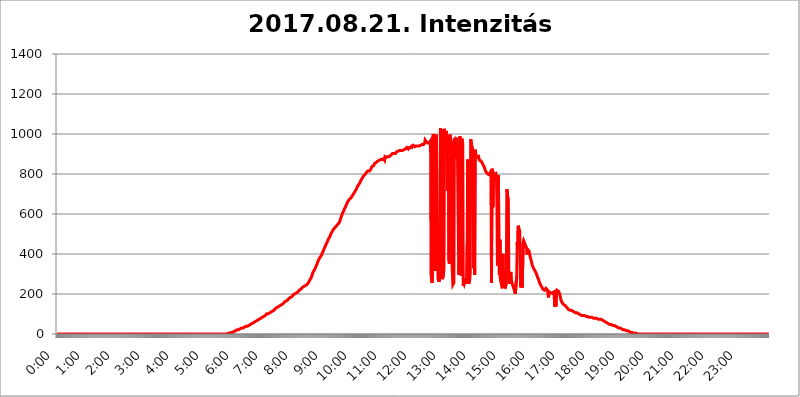
| Category | 2017.08.21. Intenzitás [W/m^2] |
|---|---|
| 0.0 | 0 |
| 0.0006944444444444445 | 0 |
| 0.001388888888888889 | 0 |
| 0.0020833333333333333 | 0 |
| 0.002777777777777778 | 0 |
| 0.003472222222222222 | 0 |
| 0.004166666666666667 | 0 |
| 0.004861111111111111 | 0 |
| 0.005555555555555556 | 0 |
| 0.0062499999999999995 | 0 |
| 0.006944444444444444 | 0 |
| 0.007638888888888889 | 0 |
| 0.008333333333333333 | 0 |
| 0.009027777777777779 | 0 |
| 0.009722222222222222 | 0 |
| 0.010416666666666666 | 0 |
| 0.011111111111111112 | 0 |
| 0.011805555555555555 | 0 |
| 0.012499999999999999 | 0 |
| 0.013194444444444444 | 0 |
| 0.013888888888888888 | 0 |
| 0.014583333333333332 | 0 |
| 0.015277777777777777 | 0 |
| 0.015972222222222224 | 0 |
| 0.016666666666666666 | 0 |
| 0.017361111111111112 | 0 |
| 0.018055555555555557 | 0 |
| 0.01875 | 0 |
| 0.019444444444444445 | 0 |
| 0.02013888888888889 | 0 |
| 0.020833333333333332 | 0 |
| 0.02152777777777778 | 0 |
| 0.022222222222222223 | 0 |
| 0.02291666666666667 | 0 |
| 0.02361111111111111 | 0 |
| 0.024305555555555556 | 0 |
| 0.024999999999999998 | 0 |
| 0.025694444444444447 | 0 |
| 0.02638888888888889 | 0 |
| 0.027083333333333334 | 0 |
| 0.027777777777777776 | 0 |
| 0.02847222222222222 | 0 |
| 0.029166666666666664 | 0 |
| 0.029861111111111113 | 0 |
| 0.030555555555555555 | 0 |
| 0.03125 | 0 |
| 0.03194444444444445 | 0 |
| 0.03263888888888889 | 0 |
| 0.03333333333333333 | 0 |
| 0.034027777777777775 | 0 |
| 0.034722222222222224 | 0 |
| 0.035416666666666666 | 0 |
| 0.036111111111111115 | 0 |
| 0.03680555555555556 | 0 |
| 0.0375 | 0 |
| 0.03819444444444444 | 0 |
| 0.03888888888888889 | 0 |
| 0.03958333333333333 | 0 |
| 0.04027777777777778 | 0 |
| 0.04097222222222222 | 0 |
| 0.041666666666666664 | 0 |
| 0.042361111111111106 | 0 |
| 0.04305555555555556 | 0 |
| 0.043750000000000004 | 0 |
| 0.044444444444444446 | 0 |
| 0.04513888888888889 | 0 |
| 0.04583333333333334 | 0 |
| 0.04652777777777778 | 0 |
| 0.04722222222222222 | 0 |
| 0.04791666666666666 | 0 |
| 0.04861111111111111 | 0 |
| 0.049305555555555554 | 0 |
| 0.049999999999999996 | 0 |
| 0.05069444444444445 | 0 |
| 0.051388888888888894 | 0 |
| 0.052083333333333336 | 0 |
| 0.05277777777777778 | 0 |
| 0.05347222222222222 | 0 |
| 0.05416666666666667 | 0 |
| 0.05486111111111111 | 0 |
| 0.05555555555555555 | 0 |
| 0.05625 | 0 |
| 0.05694444444444444 | 0 |
| 0.057638888888888885 | 0 |
| 0.05833333333333333 | 0 |
| 0.05902777777777778 | 0 |
| 0.059722222222222225 | 0 |
| 0.06041666666666667 | 0 |
| 0.061111111111111116 | 0 |
| 0.06180555555555556 | 0 |
| 0.0625 | 0 |
| 0.06319444444444444 | 0 |
| 0.06388888888888888 | 0 |
| 0.06458333333333334 | 0 |
| 0.06527777777777778 | 0 |
| 0.06597222222222222 | 0 |
| 0.06666666666666667 | 0 |
| 0.06736111111111111 | 0 |
| 0.06805555555555555 | 0 |
| 0.06874999999999999 | 0 |
| 0.06944444444444443 | 0 |
| 0.07013888888888889 | 0 |
| 0.07083333333333333 | 0 |
| 0.07152777777777779 | 0 |
| 0.07222222222222223 | 0 |
| 0.07291666666666667 | 0 |
| 0.07361111111111111 | 0 |
| 0.07430555555555556 | 0 |
| 0.075 | 0 |
| 0.07569444444444444 | 0 |
| 0.0763888888888889 | 0 |
| 0.07708333333333334 | 0 |
| 0.07777777777777778 | 0 |
| 0.07847222222222222 | 0 |
| 0.07916666666666666 | 0 |
| 0.0798611111111111 | 0 |
| 0.08055555555555556 | 0 |
| 0.08125 | 0 |
| 0.08194444444444444 | 0 |
| 0.08263888888888889 | 0 |
| 0.08333333333333333 | 0 |
| 0.08402777777777777 | 0 |
| 0.08472222222222221 | 0 |
| 0.08541666666666665 | 0 |
| 0.08611111111111112 | 0 |
| 0.08680555555555557 | 0 |
| 0.08750000000000001 | 0 |
| 0.08819444444444445 | 0 |
| 0.08888888888888889 | 0 |
| 0.08958333333333333 | 0 |
| 0.09027777777777778 | 0 |
| 0.09097222222222222 | 0 |
| 0.09166666666666667 | 0 |
| 0.09236111111111112 | 0 |
| 0.09305555555555556 | 0 |
| 0.09375 | 0 |
| 0.09444444444444444 | 0 |
| 0.09513888888888888 | 0 |
| 0.09583333333333333 | 0 |
| 0.09652777777777777 | 0 |
| 0.09722222222222222 | 0 |
| 0.09791666666666667 | 0 |
| 0.09861111111111111 | 0 |
| 0.09930555555555555 | 0 |
| 0.09999999999999999 | 0 |
| 0.10069444444444443 | 0 |
| 0.1013888888888889 | 0 |
| 0.10208333333333335 | 0 |
| 0.10277777777777779 | 0 |
| 0.10347222222222223 | 0 |
| 0.10416666666666667 | 0 |
| 0.10486111111111111 | 0 |
| 0.10555555555555556 | 0 |
| 0.10625 | 0 |
| 0.10694444444444444 | 0 |
| 0.1076388888888889 | 0 |
| 0.10833333333333334 | 0 |
| 0.10902777777777778 | 0 |
| 0.10972222222222222 | 0 |
| 0.1111111111111111 | 0 |
| 0.11180555555555556 | 0 |
| 0.11180555555555556 | 0 |
| 0.1125 | 0 |
| 0.11319444444444444 | 0 |
| 0.11388888888888889 | 0 |
| 0.11458333333333333 | 0 |
| 0.11527777777777777 | 0 |
| 0.11597222222222221 | 0 |
| 0.11666666666666665 | 0 |
| 0.1173611111111111 | 0 |
| 0.11805555555555557 | 0 |
| 0.11944444444444445 | 0 |
| 0.12013888888888889 | 0 |
| 0.12083333333333333 | 0 |
| 0.12152777777777778 | 0 |
| 0.12222222222222223 | 0 |
| 0.12291666666666667 | 0 |
| 0.12291666666666667 | 0 |
| 0.12361111111111112 | 0 |
| 0.12430555555555556 | 0 |
| 0.125 | 0 |
| 0.12569444444444444 | 0 |
| 0.12638888888888888 | 0 |
| 0.12708333333333333 | 0 |
| 0.16875 | 0 |
| 0.12847222222222224 | 0 |
| 0.12916666666666668 | 0 |
| 0.12986111111111112 | 0 |
| 0.13055555555555556 | 0 |
| 0.13125 | 0 |
| 0.13194444444444445 | 0 |
| 0.1326388888888889 | 0 |
| 0.13333333333333333 | 0 |
| 0.13402777777777777 | 0 |
| 0.13402777777777777 | 0 |
| 0.13472222222222222 | 0 |
| 0.13541666666666666 | 0 |
| 0.1361111111111111 | 0 |
| 0.13749999999999998 | 0 |
| 0.13819444444444443 | 0 |
| 0.1388888888888889 | 0 |
| 0.13958333333333334 | 0 |
| 0.14027777777777778 | 0 |
| 0.14097222222222222 | 0 |
| 0.14166666666666666 | 0 |
| 0.1423611111111111 | 0 |
| 0.14305555555555557 | 0 |
| 0.14375000000000002 | 0 |
| 0.14444444444444446 | 0 |
| 0.1451388888888889 | 0 |
| 0.1451388888888889 | 0 |
| 0.14652777777777778 | 0 |
| 0.14722222222222223 | 0 |
| 0.14791666666666667 | 0 |
| 0.1486111111111111 | 0 |
| 0.14930555555555555 | 0 |
| 0.15 | 0 |
| 0.15069444444444444 | 0 |
| 0.15138888888888888 | 0 |
| 0.15208333333333332 | 0 |
| 0.15277777777777776 | 0 |
| 0.15347222222222223 | 0 |
| 0.15416666666666667 | 0 |
| 0.15486111111111112 | 0 |
| 0.15555555555555556 | 0 |
| 0.15625 | 0 |
| 0.15694444444444444 | 0 |
| 0.15763888888888888 | 0 |
| 0.15833333333333333 | 0 |
| 0.15902777777777777 | 0 |
| 0.15972222222222224 | 0 |
| 0.16041666666666668 | 0 |
| 0.16111111111111112 | 0 |
| 0.16180555555555556 | 0 |
| 0.1625 | 0 |
| 0.16319444444444445 | 0 |
| 0.1638888888888889 | 0 |
| 0.16458333333333333 | 0 |
| 0.16527777777777777 | 0 |
| 0.16597222222222222 | 0 |
| 0.16666666666666666 | 0 |
| 0.1673611111111111 | 0 |
| 0.16805555555555554 | 0 |
| 0.16874999999999998 | 0 |
| 0.16944444444444443 | 0 |
| 0.17013888888888887 | 0 |
| 0.1708333333333333 | 0 |
| 0.17152777777777775 | 0 |
| 0.17222222222222225 | 0 |
| 0.1729166666666667 | 0 |
| 0.17361111111111113 | 0 |
| 0.17430555555555557 | 0 |
| 0.17500000000000002 | 0 |
| 0.17569444444444446 | 0 |
| 0.1763888888888889 | 0 |
| 0.17708333333333334 | 0 |
| 0.17777777777777778 | 0 |
| 0.17847222222222223 | 0 |
| 0.17916666666666667 | 0 |
| 0.1798611111111111 | 0 |
| 0.18055555555555555 | 0 |
| 0.18125 | 0 |
| 0.18194444444444444 | 0 |
| 0.1826388888888889 | 0 |
| 0.18333333333333335 | 0 |
| 0.1840277777777778 | 0 |
| 0.18472222222222223 | 0 |
| 0.18541666666666667 | 0 |
| 0.18611111111111112 | 0 |
| 0.18680555555555556 | 0 |
| 0.1875 | 0 |
| 0.18819444444444444 | 0 |
| 0.18888888888888888 | 0 |
| 0.18958333333333333 | 0 |
| 0.19027777777777777 | 0 |
| 0.1909722222222222 | 0 |
| 0.19166666666666665 | 0 |
| 0.19236111111111112 | 0 |
| 0.19305555555555554 | 0 |
| 0.19375 | 0 |
| 0.19444444444444445 | 0 |
| 0.1951388888888889 | 0 |
| 0.19583333333333333 | 0 |
| 0.19652777777777777 | 0 |
| 0.19722222222222222 | 0 |
| 0.19791666666666666 | 0 |
| 0.1986111111111111 | 0 |
| 0.19930555555555554 | 0 |
| 0.19999999999999998 | 0 |
| 0.20069444444444443 | 0 |
| 0.20138888888888887 | 0 |
| 0.2020833333333333 | 0 |
| 0.2027777777777778 | 0 |
| 0.2034722222222222 | 0 |
| 0.2041666666666667 | 0 |
| 0.20486111111111113 | 0 |
| 0.20555555555555557 | 0 |
| 0.20625000000000002 | 0 |
| 0.20694444444444446 | 0 |
| 0.2076388888888889 | 0 |
| 0.20833333333333334 | 0 |
| 0.20902777777777778 | 0 |
| 0.20972222222222223 | 0 |
| 0.21041666666666667 | 0 |
| 0.2111111111111111 | 0 |
| 0.21180555555555555 | 0 |
| 0.2125 | 0 |
| 0.21319444444444444 | 0 |
| 0.2138888888888889 | 0 |
| 0.21458333333333335 | 0 |
| 0.2152777777777778 | 0 |
| 0.21597222222222223 | 0 |
| 0.21666666666666667 | 0 |
| 0.21736111111111112 | 0 |
| 0.21805555555555556 | 0 |
| 0.21875 | 0 |
| 0.21944444444444444 | 0 |
| 0.22013888888888888 | 0 |
| 0.22083333333333333 | 0 |
| 0.22152777777777777 | 0 |
| 0.2222222222222222 | 0 |
| 0.22291666666666665 | 0 |
| 0.2236111111111111 | 0 |
| 0.22430555555555556 | 0 |
| 0.225 | 0 |
| 0.22569444444444445 | 0 |
| 0.2263888888888889 | 0 |
| 0.22708333333333333 | 0 |
| 0.22777777777777777 | 0 |
| 0.22847222222222222 | 0 |
| 0.22916666666666666 | 0 |
| 0.2298611111111111 | 0 |
| 0.23055555555555554 | 0 |
| 0.23124999999999998 | 0 |
| 0.23194444444444443 | 0 |
| 0.23263888888888887 | 0 |
| 0.2333333333333333 | 0 |
| 0.2340277777777778 | 0 |
| 0.2347222222222222 | 0 |
| 0.2354166666666667 | 0 |
| 0.23611111111111113 | 0 |
| 0.23680555555555557 | 0 |
| 0.23750000000000002 | 0 |
| 0.23819444444444446 | 0 |
| 0.2388888888888889 | 3.525 |
| 0.23958333333333334 | 3.525 |
| 0.24027777777777778 | 3.525 |
| 0.24097222222222223 | 3.525 |
| 0.24166666666666667 | 3.525 |
| 0.2423611111111111 | 3.525 |
| 0.24305555555555555 | 3.525 |
| 0.24375 | 7.887 |
| 0.24444444444444446 | 7.887 |
| 0.24513888888888888 | 7.887 |
| 0.24583333333333335 | 7.887 |
| 0.2465277777777778 | 12.257 |
| 0.24722222222222223 | 12.257 |
| 0.24791666666666667 | 12.257 |
| 0.24861111111111112 | 12.257 |
| 0.24930555555555556 | 12.257 |
| 0.25 | 16.636 |
| 0.25069444444444444 | 16.636 |
| 0.2513888888888889 | 16.636 |
| 0.2520833333333333 | 21.024 |
| 0.25277777777777777 | 21.024 |
| 0.2534722222222222 | 21.024 |
| 0.25416666666666665 | 21.024 |
| 0.2548611111111111 | 21.024 |
| 0.2555555555555556 | 21.024 |
| 0.25625000000000003 | 25.419 |
| 0.2569444444444445 | 25.419 |
| 0.2576388888888889 | 25.419 |
| 0.25833333333333336 | 29.823 |
| 0.2590277777777778 | 29.823 |
| 0.25972222222222224 | 29.823 |
| 0.2604166666666667 | 29.823 |
| 0.2611111111111111 | 29.823 |
| 0.26180555555555557 | 29.823 |
| 0.2625 | 34.234 |
| 0.26319444444444445 | 34.234 |
| 0.2638888888888889 | 34.234 |
| 0.26458333333333334 | 38.653 |
| 0.2652777777777778 | 38.653 |
| 0.2659722222222222 | 38.653 |
| 0.26666666666666666 | 38.653 |
| 0.2673611111111111 | 43.079 |
| 0.26805555555555555 | 43.079 |
| 0.26875 | 43.079 |
| 0.26944444444444443 | 43.079 |
| 0.2701388888888889 | 47.511 |
| 0.2708333333333333 | 47.511 |
| 0.27152777777777776 | 47.511 |
| 0.2722222222222222 | 51.951 |
| 0.27291666666666664 | 51.951 |
| 0.2736111111111111 | 51.951 |
| 0.2743055555555555 | 56.398 |
| 0.27499999999999997 | 56.398 |
| 0.27569444444444446 | 56.398 |
| 0.27638888888888885 | 56.398 |
| 0.27708333333333335 | 60.85 |
| 0.2777777777777778 | 60.85 |
| 0.27847222222222223 | 65.31 |
| 0.2791666666666667 | 65.31 |
| 0.2798611111111111 | 65.31 |
| 0.28055555555555556 | 65.31 |
| 0.28125 | 69.775 |
| 0.28194444444444444 | 69.775 |
| 0.2826388888888889 | 74.246 |
| 0.2833333333333333 | 74.246 |
| 0.28402777777777777 | 74.246 |
| 0.2847222222222222 | 78.722 |
| 0.28541666666666665 | 78.722 |
| 0.28611111111111115 | 83.205 |
| 0.28680555555555554 | 83.205 |
| 0.28750000000000003 | 83.205 |
| 0.2881944444444445 | 83.205 |
| 0.2888888888888889 | 87.692 |
| 0.28958333333333336 | 87.692 |
| 0.2902777777777778 | 92.184 |
| 0.29097222222222224 | 92.184 |
| 0.2916666666666667 | 92.184 |
| 0.2923611111111111 | 92.184 |
| 0.29305555555555557 | 96.682 |
| 0.29375 | 101.184 |
| 0.29444444444444445 | 101.184 |
| 0.2951388888888889 | 101.184 |
| 0.29583333333333334 | 101.184 |
| 0.2965277777777778 | 101.184 |
| 0.2972222222222222 | 105.69 |
| 0.29791666666666666 | 105.69 |
| 0.2986111111111111 | 110.201 |
| 0.29930555555555555 | 110.201 |
| 0.3 | 110.201 |
| 0.30069444444444443 | 110.201 |
| 0.3013888888888889 | 114.716 |
| 0.3020833333333333 | 114.716 |
| 0.30277777777777776 | 119.235 |
| 0.3034722222222222 | 119.235 |
| 0.30416666666666664 | 119.235 |
| 0.3048611111111111 | 123.758 |
| 0.3055555555555555 | 123.758 |
| 0.30624999999999997 | 128.284 |
| 0.3069444444444444 | 128.284 |
| 0.3076388888888889 | 128.284 |
| 0.30833333333333335 | 132.814 |
| 0.3090277777777778 | 132.814 |
| 0.30972222222222223 | 137.347 |
| 0.3104166666666667 | 137.347 |
| 0.3111111111111111 | 137.347 |
| 0.31180555555555556 | 141.884 |
| 0.3125 | 141.884 |
| 0.31319444444444444 | 141.884 |
| 0.3138888888888889 | 146.423 |
| 0.3145833333333333 | 146.423 |
| 0.31527777777777777 | 146.423 |
| 0.3159722222222222 | 150.964 |
| 0.31666666666666665 | 150.964 |
| 0.31736111111111115 | 155.509 |
| 0.31805555555555554 | 155.509 |
| 0.31875000000000003 | 160.056 |
| 0.3194444444444445 | 160.056 |
| 0.3201388888888889 | 160.056 |
| 0.32083333333333336 | 164.605 |
| 0.3215277777777778 | 164.605 |
| 0.32222222222222224 | 169.156 |
| 0.3229166666666667 | 169.156 |
| 0.3236111111111111 | 173.709 |
| 0.32430555555555557 | 173.709 |
| 0.325 | 178.264 |
| 0.32569444444444445 | 178.264 |
| 0.3263888888888889 | 182.82 |
| 0.32708333333333334 | 182.82 |
| 0.3277777777777778 | 182.82 |
| 0.3284722222222222 | 187.378 |
| 0.32916666666666666 | 187.378 |
| 0.3298611111111111 | 191.937 |
| 0.33055555555555555 | 191.937 |
| 0.33125 | 196.497 |
| 0.33194444444444443 | 196.497 |
| 0.3326388888888889 | 196.497 |
| 0.3333333333333333 | 201.058 |
| 0.3340277777777778 | 201.058 |
| 0.3347222222222222 | 201.058 |
| 0.3354166666666667 | 205.62 |
| 0.3361111111111111 | 205.62 |
| 0.3368055555555556 | 210.182 |
| 0.33749999999999997 | 210.182 |
| 0.33819444444444446 | 214.746 |
| 0.33888888888888885 | 214.746 |
| 0.33958333333333335 | 219.309 |
| 0.34027777777777773 | 219.309 |
| 0.34097222222222223 | 219.309 |
| 0.3416666666666666 | 223.873 |
| 0.3423611111111111 | 223.873 |
| 0.3430555555555555 | 228.436 |
| 0.34375 | 233 |
| 0.3444444444444445 | 233 |
| 0.3451388888888889 | 233 |
| 0.3458333333333334 | 237.564 |
| 0.34652777777777777 | 237.564 |
| 0.34722222222222227 | 242.127 |
| 0.34791666666666665 | 242.127 |
| 0.34861111111111115 | 246.689 |
| 0.34930555555555554 | 246.689 |
| 0.35000000000000003 | 246.689 |
| 0.3506944444444444 | 251.251 |
| 0.3513888888888889 | 251.251 |
| 0.3520833333333333 | 255.813 |
| 0.3527777777777778 | 260.373 |
| 0.3534722222222222 | 264.932 |
| 0.3541666666666667 | 269.49 |
| 0.3548611111111111 | 274.047 |
| 0.35555555555555557 | 278.603 |
| 0.35625 | 283.156 |
| 0.35694444444444445 | 287.709 |
| 0.3576388888888889 | 296.808 |
| 0.35833333333333334 | 305.898 |
| 0.3590277777777778 | 310.44 |
| 0.3597222222222222 | 314.98 |
| 0.36041666666666666 | 319.517 |
| 0.3611111111111111 | 324.052 |
| 0.36180555555555555 | 328.584 |
| 0.3625 | 333.113 |
| 0.36319444444444443 | 342.162 |
| 0.3638888888888889 | 346.682 |
| 0.3645833333333333 | 351.198 |
| 0.3652777777777778 | 360.221 |
| 0.3659722222222222 | 364.728 |
| 0.3666666666666667 | 369.23 |
| 0.3673611111111111 | 378.224 |
| 0.3680555555555556 | 378.224 |
| 0.36874999999999997 | 382.715 |
| 0.36944444444444446 | 387.202 |
| 0.37013888888888885 | 391.685 |
| 0.37083333333333335 | 396.164 |
| 0.37152777777777773 | 400.638 |
| 0.37222222222222223 | 409.574 |
| 0.3729166666666666 | 414.035 |
| 0.3736111111111111 | 418.492 |
| 0.3743055555555555 | 427.39 |
| 0.375 | 431.833 |
| 0.3756944444444445 | 436.27 |
| 0.3763888888888889 | 440.702 |
| 0.3770833333333334 | 449.551 |
| 0.37777777777777777 | 453.968 |
| 0.37847222222222227 | 458.38 |
| 0.37916666666666665 | 462.786 |
| 0.37986111111111115 | 471.582 |
| 0.38055555555555554 | 475.972 |
| 0.38125000000000003 | 480.356 |
| 0.3819444444444444 | 484.735 |
| 0.3826388888888889 | 489.108 |
| 0.3833333333333333 | 497.836 |
| 0.3840277777777778 | 497.836 |
| 0.3847222222222222 | 506.542 |
| 0.3854166666666667 | 510.885 |
| 0.3861111111111111 | 515.223 |
| 0.38680555555555557 | 519.555 |
| 0.3875 | 523.88 |
| 0.38819444444444445 | 528.2 |
| 0.3888888888888889 | 528.2 |
| 0.38958333333333334 | 532.513 |
| 0.3902777777777778 | 532.513 |
| 0.3909722222222222 | 536.82 |
| 0.39166666666666666 | 541.121 |
| 0.3923611111111111 | 545.416 |
| 0.39305555555555555 | 545.416 |
| 0.39375 | 549.704 |
| 0.39444444444444443 | 549.704 |
| 0.3951388888888889 | 553.986 |
| 0.3958333333333333 | 558.261 |
| 0.3965277777777778 | 566.793 |
| 0.3972222222222222 | 575.299 |
| 0.3979166666666667 | 579.542 |
| 0.3986111111111111 | 588.009 |
| 0.3993055555555556 | 596.45 |
| 0.39999999999999997 | 600.661 |
| 0.40069444444444446 | 609.062 |
| 0.40138888888888885 | 613.252 |
| 0.40208333333333335 | 617.436 |
| 0.40277777777777773 | 625.784 |
| 0.40347222222222223 | 629.948 |
| 0.4041666666666666 | 634.105 |
| 0.4048611111111111 | 642.4 |
| 0.4055555555555555 | 646.537 |
| 0.40625 | 650.667 |
| 0.4069444444444445 | 658.909 |
| 0.4076388888888889 | 663.019 |
| 0.4083333333333334 | 667.123 |
| 0.40902777777777777 | 667.123 |
| 0.40972222222222227 | 671.22 |
| 0.41041666666666665 | 675.311 |
| 0.41111111111111115 | 675.311 |
| 0.41180555555555554 | 679.395 |
| 0.41250000000000003 | 683.473 |
| 0.4131944444444444 | 687.544 |
| 0.4138888888888889 | 687.544 |
| 0.4145833333333333 | 695.666 |
| 0.4152777777777778 | 699.717 |
| 0.4159722222222222 | 703.762 |
| 0.4166666666666667 | 703.762 |
| 0.4173611111111111 | 707.8 |
| 0.41805555555555557 | 715.858 |
| 0.41875 | 719.877 |
| 0.41944444444444445 | 723.889 |
| 0.4201388888888889 | 731.896 |
| 0.42083333333333334 | 735.89 |
| 0.4215277777777778 | 735.89 |
| 0.4222222222222222 | 743.859 |
| 0.42291666666666666 | 747.834 |
| 0.4236111111111111 | 751.803 |
| 0.42430555555555555 | 755.766 |
| 0.425 | 759.723 |
| 0.42569444444444443 | 767.62 |
| 0.4263888888888889 | 771.559 |
| 0.4270833333333333 | 775.492 |
| 0.4277777777777778 | 779.42 |
| 0.4284722222222222 | 783.342 |
| 0.4291666666666667 | 787.258 |
| 0.4298611111111111 | 791.169 |
| 0.4305555555555556 | 795.074 |
| 0.43124999999999997 | 795.074 |
| 0.43194444444444446 | 798.974 |
| 0.43263888888888885 | 802.868 |
| 0.43333333333333335 | 806.757 |
| 0.43402777777777773 | 806.757 |
| 0.43472222222222223 | 810.641 |
| 0.4354166666666666 | 814.519 |
| 0.4361111111111111 | 814.519 |
| 0.4368055555555555 | 814.519 |
| 0.4375 | 814.519 |
| 0.4381944444444445 | 814.519 |
| 0.4388888888888889 | 818.392 |
| 0.4395833333333334 | 822.26 |
| 0.44027777777777777 | 829.981 |
| 0.44097222222222227 | 833.834 |
| 0.44166666666666665 | 837.682 |
| 0.44236111111111115 | 841.526 |
| 0.44305555555555554 | 841.526 |
| 0.44375000000000003 | 841.526 |
| 0.4444444444444444 | 845.365 |
| 0.4451388888888889 | 853.029 |
| 0.4458333333333333 | 853.029 |
| 0.4465277777777778 | 856.855 |
| 0.4472222222222222 | 856.855 |
| 0.4479166666666667 | 860.676 |
| 0.4486111111111111 | 860.676 |
| 0.44930555555555557 | 864.493 |
| 0.45 | 860.676 |
| 0.45069444444444445 | 864.493 |
| 0.4513888888888889 | 868.305 |
| 0.45208333333333334 | 868.305 |
| 0.4527777777777778 | 872.114 |
| 0.4534722222222222 | 872.114 |
| 0.45416666666666666 | 872.114 |
| 0.4548611111111111 | 872.114 |
| 0.45555555555555555 | 872.114 |
| 0.45625 | 872.114 |
| 0.45694444444444443 | 875.918 |
| 0.4576388888888889 | 875.918 |
| 0.4583333333333333 | 875.918 |
| 0.4590277777777778 | 868.305 |
| 0.4597222222222222 | 887.309 |
| 0.4604166666666667 | 887.309 |
| 0.4611111111111111 | 887.309 |
| 0.4618055555555556 | 883.516 |
| 0.46249999999999997 | 887.309 |
| 0.46319444444444446 | 887.309 |
| 0.46388888888888885 | 887.309 |
| 0.46458333333333335 | 887.309 |
| 0.46527777777777773 | 887.309 |
| 0.46597222222222223 | 887.309 |
| 0.4666666666666666 | 887.309 |
| 0.4673611111111111 | 891.099 |
| 0.4680555555555555 | 894.885 |
| 0.46875 | 894.885 |
| 0.4694444444444445 | 898.668 |
| 0.4701388888888889 | 902.447 |
| 0.4708333333333334 | 898.668 |
| 0.47152777777777777 | 902.447 |
| 0.47222222222222227 | 902.447 |
| 0.47291666666666665 | 906.223 |
| 0.47361111111111115 | 906.223 |
| 0.47430555555555554 | 902.447 |
| 0.47500000000000003 | 906.223 |
| 0.4756944444444444 | 909.996 |
| 0.4763888888888889 | 909.996 |
| 0.4770833333333333 | 913.766 |
| 0.4777777777777778 | 913.766 |
| 0.4784722222222222 | 913.766 |
| 0.4791666666666667 | 913.766 |
| 0.4798611111111111 | 917.534 |
| 0.48055555555555557 | 917.534 |
| 0.48125 | 917.534 |
| 0.48194444444444445 | 917.534 |
| 0.4826388888888889 | 921.298 |
| 0.48333333333333334 | 921.298 |
| 0.4840277777777778 | 917.534 |
| 0.4847222222222222 | 921.298 |
| 0.48541666666666666 | 917.534 |
| 0.4861111111111111 | 921.298 |
| 0.48680555555555555 | 921.298 |
| 0.4875 | 921.298 |
| 0.48819444444444443 | 925.06 |
| 0.4888888888888889 | 928.819 |
| 0.4895833333333333 | 928.819 |
| 0.4902777777777778 | 932.576 |
| 0.4909722222222222 | 928.819 |
| 0.4916666666666667 | 928.819 |
| 0.4923611111111111 | 925.06 |
| 0.4930555555555556 | 928.819 |
| 0.49374999999999997 | 932.576 |
| 0.49444444444444446 | 932.576 |
| 0.49513888888888885 | 936.33 |
| 0.49583333333333335 | 932.576 |
| 0.49652777777777773 | 925.06 |
| 0.49722222222222223 | 940.082 |
| 0.4979166666666666 | 943.832 |
| 0.4986111111111111 | 943.832 |
| 0.4993055555555555 | 943.832 |
| 0.5 | 943.832 |
| 0.5006944444444444 | 940.082 |
| 0.5013888888888889 | 936.33 |
| 0.5020833333333333 | 940.082 |
| 0.5027777777777778 | 940.082 |
| 0.5034722222222222 | 940.082 |
| 0.5041666666666667 | 940.082 |
| 0.5048611111111111 | 940.082 |
| 0.5055555555555555 | 940.082 |
| 0.50625 | 940.082 |
| 0.5069444444444444 | 943.832 |
| 0.5076388888888889 | 940.082 |
| 0.5083333333333333 | 943.832 |
| 0.5090277777777777 | 943.832 |
| 0.5097222222222222 | 943.832 |
| 0.5104166666666666 | 943.832 |
| 0.5111111111111112 | 940.082 |
| 0.5118055555555555 | 947.58 |
| 0.5125000000000001 | 947.58 |
| 0.5131944444444444 | 947.58 |
| 0.513888888888889 | 947.58 |
| 0.5145833333333333 | 951.327 |
| 0.5152777777777778 | 955.071 |
| 0.5159722222222222 | 970.034 |
| 0.5166666666666667 | 970.034 |
| 0.517361111111111 | 962.555 |
| 0.5180555555555556 | 962.555 |
| 0.5187499999999999 | 958.814 |
| 0.5194444444444445 | 955.071 |
| 0.5201388888888888 | 951.327 |
| 0.5208333333333334 | 951.327 |
| 0.5215277777777778 | 955.071 |
| 0.5222222222222223 | 955.071 |
| 0.5229166666666667 | 958.814 |
| 0.5236111111111111 | 966.295 |
| 0.5243055555555556 | 296.808 |
| 0.525 | 278.603 |
| 0.5256944444444445 | 255.813 |
| 0.5263888888888889 | 301.354 |
| 0.5270833333333333 | 999.916 |
| 0.5277777777777778 | 996.182 |
| 0.5284722222222222 | 984.98 |
| 0.5291666666666667 | 977.508 |
| 0.5298611111111111 | 902.447 |
| 0.5305555555555556 | 314.98 |
| 0.53125 | 996.182 |
| 0.5319444444444444 | 977.508 |
| 0.5326388888888889 | 981.244 |
| 0.5333333333333333 | 981.244 |
| 0.5340277777777778 | 278.603 |
| 0.5347222222222222 | 269.49 |
| 0.5354166666666667 | 260.373 |
| 0.5361111111111111 | 264.932 |
| 0.5368055555555555 | 296.808 |
| 0.5375 | 1029.798 |
| 0.5381944444444444 | 879.719 |
| 0.5388888888888889 | 1022.323 |
| 0.5395833333333333 | 301.354 |
| 0.5402777777777777 | 274.047 |
| 0.5409722222222222 | 269.49 |
| 0.5416666666666666 | 301.354 |
| 0.5423611111111112 | 324.052 |
| 0.5430555555555555 | 1026.06 |
| 0.5437500000000001 | 1022.323 |
| 0.5444444444444444 | 966.295 |
| 0.545138888888889 | 1014.852 |
| 0.5458333333333333 | 1007.383 |
| 0.5465277777777778 | 1003.65 |
| 0.5472222222222222 | 715.858 |
| 0.5479166666666667 | 864.493 |
| 0.548611111111111 | 996.182 |
| 0.5493055555555556 | 369.23 |
| 0.5499999999999999 | 351.198 |
| 0.5506944444444445 | 996.182 |
| 0.5513888888888888 | 981.244 |
| 0.5520833333333334 | 958.814 |
| 0.5527777777777778 | 966.295 |
| 0.5534722222222223 | 966.295 |
| 0.5541666666666667 | 314.98 |
| 0.5548611111111111 | 246.689 |
| 0.5555555555555556 | 242.127 |
| 0.55625 | 255.813 |
| 0.5569444444444445 | 977.508 |
| 0.5576388888888889 | 977.508 |
| 0.5583333333333333 | 875.918 |
| 0.5590277777777778 | 977.508 |
| 0.5597222222222222 | 973.772 |
| 0.5604166666666667 | 973.772 |
| 0.5611111111111111 | 973.772 |
| 0.5618055555555556 | 970.034 |
| 0.5625 | 970.034 |
| 0.5631944444444444 | 296.808 |
| 0.5638888888888889 | 364.728 |
| 0.5645833333333333 | 988.714 |
| 0.5652777777777778 | 973.772 |
| 0.5659722222222222 | 977.508 |
| 0.5666666666666667 | 292.259 |
| 0.5673611111111111 | 977.508 |
| 0.5680555555555555 | 962.555 |
| 0.56875 | 955.071 |
| 0.5694444444444444 | 242.127 |
| 0.5701388888888889 | 260.373 |
| 0.5708333333333333 | 251.251 |
| 0.5715277777777777 | 246.689 |
| 0.5722222222222222 | 269.49 |
| 0.5729166666666666 | 278.603 |
| 0.5736111111111112 | 264.932 |
| 0.5743055555555555 | 251.251 |
| 0.5750000000000001 | 449.551 |
| 0.5756944444444444 | 872.114 |
| 0.576388888888889 | 264.932 |
| 0.5770833333333333 | 251.251 |
| 0.5777777777777778 | 255.813 |
| 0.5784722222222222 | 269.49 |
| 0.5791666666666667 | 305.898 |
| 0.579861111111111 | 973.772 |
| 0.5805555555555556 | 962.555 |
| 0.5812499999999999 | 947.58 |
| 0.5819444444444445 | 936.33 |
| 0.5826388888888888 | 925.06 |
| 0.5833333333333334 | 921.298 |
| 0.5840277777777778 | 328.584 |
| 0.5847222222222223 | 654.791 |
| 0.5854166666666667 | 296.808 |
| 0.5861111111111111 | 921.298 |
| 0.5868055555555556 | 906.223 |
| 0.5875 | 894.885 |
| 0.5881944444444445 | 891.099 |
| 0.5888888888888889 | 883.516 |
| 0.5895833333333333 | 883.516 |
| 0.5902777777777778 | 879.719 |
| 0.5909722222222222 | 887.309 |
| 0.5916666666666667 | 875.918 |
| 0.5923611111111111 | 868.305 |
| 0.5930555555555556 | 868.305 |
| 0.59375 | 868.305 |
| 0.5944444444444444 | 864.493 |
| 0.5951388888888889 | 860.676 |
| 0.5958333333333333 | 856.855 |
| 0.5965277777777778 | 853.029 |
| 0.5972222222222222 | 845.365 |
| 0.5979166666666667 | 845.365 |
| 0.5986111111111111 | 837.682 |
| 0.5993055555555555 | 829.981 |
| 0.6 | 822.26 |
| 0.6006944444444444 | 814.519 |
| 0.6013888888888889 | 810.641 |
| 0.6020833333333333 | 806.757 |
| 0.6027777777777777 | 802.868 |
| 0.6034722222222222 | 802.868 |
| 0.6041666666666666 | 798.974 |
| 0.6048611111111112 | 798.974 |
| 0.6055555555555555 | 795.074 |
| 0.6062500000000001 | 795.074 |
| 0.6069444444444444 | 802.868 |
| 0.607638888888889 | 806.757 |
| 0.6083333333333333 | 795.074 |
| 0.6090277777777778 | 255.813 |
| 0.6097222222222222 | 826.123 |
| 0.6104166666666667 | 814.519 |
| 0.611111111111111 | 634.105 |
| 0.6118055555555556 | 806.757 |
| 0.6124999999999999 | 802.868 |
| 0.6131944444444445 | 798.974 |
| 0.6138888888888888 | 795.074 |
| 0.6145833333333334 | 798.974 |
| 0.6152777777777778 | 802.868 |
| 0.6159722222222223 | 787.258 |
| 0.6166666666666667 | 658.909 |
| 0.6173611111111111 | 342.162 |
| 0.6180555555555556 | 414.035 |
| 0.61875 | 795.074 |
| 0.6194444444444445 | 400.638 |
| 0.6201388888888889 | 296.808 |
| 0.6208333333333333 | 471.582 |
| 0.6215277777777778 | 274.047 |
| 0.6222222222222222 | 260.373 |
| 0.6229166666666667 | 251.251 |
| 0.6236111111111111 | 237.564 |
| 0.6243055555555556 | 228.436 |
| 0.625 | 400.638 |
| 0.6256944444444444 | 260.373 |
| 0.6263888888888889 | 237.564 |
| 0.6270833333333333 | 233 |
| 0.6277777777777778 | 233 |
| 0.6284722222222222 | 233 |
| 0.6291666666666667 | 233 |
| 0.6298611111111111 | 251.251 |
| 0.6305555555555555 | 723.889 |
| 0.63125 | 711.832 |
| 0.6319444444444444 | 683.473 |
| 0.6326388888888889 | 675.311 |
| 0.6333333333333333 | 283.156 |
| 0.6340277777777777 | 251.251 |
| 0.6347222222222222 | 251.251 |
| 0.6354166666666666 | 255.813 |
| 0.6361111111111112 | 310.44 |
| 0.6368055555555555 | 274.047 |
| 0.6375000000000001 | 260.373 |
| 0.6381944444444444 | 251.251 |
| 0.638888888888889 | 242.127 |
| 0.6395833333333333 | 237.564 |
| 0.6402777777777778 | 228.436 |
| 0.6409722222222222 | 219.309 |
| 0.6416666666666667 | 210.182 |
| 0.642361111111111 | 201.058 |
| 0.6430555555555556 | 196.497 |
| 0.6437499999999999 | 201.058 |
| 0.6444444444444445 | 287.709 |
| 0.6451388888888888 | 458.38 |
| 0.6458333333333334 | 422.943 |
| 0.6465277777777778 | 541.121 |
| 0.6472222222222223 | 532.513 |
| 0.6479166666666667 | 523.88 |
| 0.6486111111111111 | 515.223 |
| 0.6493055555555556 | 519.555 |
| 0.65 | 233 |
| 0.6506944444444445 | 305.898 |
| 0.6513888888888889 | 342.162 |
| 0.6520833333333333 | 233 |
| 0.6527777777777778 | 228.436 |
| 0.6534722222222222 | 458.38 |
| 0.6541666666666667 | 467.187 |
| 0.6548611111111111 | 462.786 |
| 0.6555555555555556 | 453.968 |
| 0.65625 | 449.551 |
| 0.6569444444444444 | 440.702 |
| 0.6576388888888889 | 436.27 |
| 0.6583333333333333 | 427.39 |
| 0.6590277777777778 | 396.164 |
| 0.6597222222222222 | 422.943 |
| 0.6604166666666667 | 422.943 |
| 0.6611111111111111 | 418.492 |
| 0.6618055555555555 | 414.035 |
| 0.6625 | 400.638 |
| 0.6631944444444444 | 387.202 |
| 0.6638888888888889 | 378.224 |
| 0.6645833333333333 | 369.23 |
| 0.6652777777777777 | 360.221 |
| 0.6659722222222222 | 346.682 |
| 0.6666666666666666 | 342.162 |
| 0.6673611111111111 | 333.113 |
| 0.6680555555555556 | 328.584 |
| 0.6687500000000001 | 324.052 |
| 0.6694444444444444 | 319.517 |
| 0.6701388888888888 | 314.98 |
| 0.6708333333333334 | 310.44 |
| 0.6715277777777778 | 305.898 |
| 0.6722222222222222 | 301.354 |
| 0.6729166666666666 | 292.259 |
| 0.6736111111111112 | 283.156 |
| 0.6743055555555556 | 278.603 |
| 0.6749999999999999 | 274.047 |
| 0.6756944444444444 | 264.932 |
| 0.6763888888888889 | 260.373 |
| 0.6770833333333334 | 251.251 |
| 0.6777777777777777 | 246.689 |
| 0.6784722222222223 | 242.127 |
| 0.6791666666666667 | 237.564 |
| 0.6798611111111111 | 233 |
| 0.6805555555555555 | 228.436 |
| 0.68125 | 223.873 |
| 0.6819444444444445 | 219.309 |
| 0.6826388888888889 | 219.309 |
| 0.6833333333333332 | 219.309 |
| 0.6840277777777778 | 219.309 |
| 0.6847222222222222 | 223.873 |
| 0.6854166666666667 | 228.436 |
| 0.686111111111111 | 228.436 |
| 0.6868055555555556 | 223.873 |
| 0.6875 | 219.309 |
| 0.6881944444444444 | 219.309 |
| 0.688888888888889 | 182.82 |
| 0.6895833333333333 | 201.058 |
| 0.6902777777777778 | 210.182 |
| 0.6909722222222222 | 210.182 |
| 0.6916666666666668 | 210.182 |
| 0.6923611111111111 | 205.62 |
| 0.6930555555555555 | 201.058 |
| 0.69375 | 205.62 |
| 0.6944444444444445 | 205.62 |
| 0.6951388888888889 | 210.182 |
| 0.6958333333333333 | 210.182 |
| 0.6965277777777777 | 210.182 |
| 0.6972222222222223 | 210.182 |
| 0.6979166666666666 | 137.347 |
| 0.6986111111111111 | 214.746 |
| 0.6993055555555556 | 137.347 |
| 0.7000000000000001 | 210.182 |
| 0.7006944444444444 | 219.309 |
| 0.7013888888888888 | 219.309 |
| 0.7020833333333334 | 214.746 |
| 0.7027777777777778 | 214.746 |
| 0.7034722222222222 | 210.182 |
| 0.7041666666666666 | 205.62 |
| 0.7048611111111112 | 201.058 |
| 0.7055555555555556 | 187.378 |
| 0.7062499999999999 | 173.709 |
| 0.7069444444444444 | 164.605 |
| 0.7076388888888889 | 160.056 |
| 0.7083333333333334 | 155.509 |
| 0.7090277777777777 | 155.509 |
| 0.7097222222222223 | 150.964 |
| 0.7104166666666667 | 146.423 |
| 0.7111111111111111 | 146.423 |
| 0.7118055555555555 | 141.884 |
| 0.7125 | 141.884 |
| 0.7131944444444445 | 137.347 |
| 0.7138888888888889 | 137.347 |
| 0.7145833333333332 | 132.814 |
| 0.7152777777777778 | 128.284 |
| 0.7159722222222222 | 128.284 |
| 0.7166666666666667 | 123.758 |
| 0.717361111111111 | 123.758 |
| 0.7180555555555556 | 119.235 |
| 0.71875 | 119.235 |
| 0.7194444444444444 | 119.235 |
| 0.720138888888889 | 119.235 |
| 0.7208333333333333 | 119.235 |
| 0.7215277777777778 | 114.716 |
| 0.7222222222222222 | 114.716 |
| 0.7229166666666668 | 114.716 |
| 0.7236111111111111 | 110.201 |
| 0.7243055555555555 | 110.201 |
| 0.725 | 110.201 |
| 0.7256944444444445 | 110.201 |
| 0.7263888888888889 | 110.201 |
| 0.7270833333333333 | 105.69 |
| 0.7277777777777777 | 105.69 |
| 0.7284722222222223 | 105.69 |
| 0.7291666666666666 | 105.69 |
| 0.7298611111111111 | 101.184 |
| 0.7305555555555556 | 101.184 |
| 0.7312500000000001 | 101.184 |
| 0.7319444444444444 | 101.184 |
| 0.7326388888888888 | 96.682 |
| 0.7333333333333334 | 96.682 |
| 0.7340277777777778 | 96.682 |
| 0.7347222222222222 | 96.682 |
| 0.7354166666666666 | 92.184 |
| 0.7361111111111112 | 92.184 |
| 0.7368055555555556 | 92.184 |
| 0.7374999999999999 | 92.184 |
| 0.7381944444444444 | 92.184 |
| 0.7388888888888889 | 92.184 |
| 0.7395833333333334 | 92.184 |
| 0.7402777777777777 | 87.692 |
| 0.7409722222222223 | 87.692 |
| 0.7416666666666667 | 87.692 |
| 0.7423611111111111 | 87.692 |
| 0.7430555555555555 | 87.692 |
| 0.74375 | 87.692 |
| 0.7444444444444445 | 83.205 |
| 0.7451388888888889 | 83.205 |
| 0.7458333333333332 | 83.205 |
| 0.7465277777777778 | 83.205 |
| 0.7472222222222222 | 83.205 |
| 0.7479166666666667 | 83.205 |
| 0.748611111111111 | 83.205 |
| 0.7493055555555556 | 83.205 |
| 0.75 | 83.205 |
| 0.7506944444444444 | 83.205 |
| 0.751388888888889 | 83.205 |
| 0.7520833333333333 | 78.722 |
| 0.7527777777777778 | 78.722 |
| 0.7534722222222222 | 78.722 |
| 0.7541666666666668 | 78.722 |
| 0.7548611111111111 | 78.722 |
| 0.7555555555555555 | 78.722 |
| 0.75625 | 78.722 |
| 0.7569444444444445 | 74.246 |
| 0.7576388888888889 | 74.246 |
| 0.7583333333333333 | 74.246 |
| 0.7590277777777777 | 74.246 |
| 0.7597222222222223 | 74.246 |
| 0.7604166666666666 | 74.246 |
| 0.7611111111111111 | 74.246 |
| 0.7618055555555556 | 74.246 |
| 0.7625000000000001 | 74.246 |
| 0.7631944444444444 | 69.775 |
| 0.7638888888888888 | 69.775 |
| 0.7645833333333334 | 69.775 |
| 0.7652777777777778 | 69.775 |
| 0.7659722222222222 | 65.31 |
| 0.7666666666666666 | 65.31 |
| 0.7673611111111112 | 65.31 |
| 0.7680555555555556 | 65.31 |
| 0.7687499999999999 | 60.85 |
| 0.7694444444444444 | 60.85 |
| 0.7701388888888889 | 56.398 |
| 0.7708333333333334 | 56.398 |
| 0.7715277777777777 | 56.398 |
| 0.7722222222222223 | 56.398 |
| 0.7729166666666667 | 51.951 |
| 0.7736111111111111 | 51.951 |
| 0.7743055555555555 | 51.951 |
| 0.775 | 47.511 |
| 0.7756944444444445 | 47.511 |
| 0.7763888888888889 | 47.511 |
| 0.7770833333333332 | 47.511 |
| 0.7777777777777778 | 47.511 |
| 0.7784722222222222 | 47.511 |
| 0.7791666666666667 | 43.079 |
| 0.779861111111111 | 43.079 |
| 0.7805555555555556 | 43.079 |
| 0.78125 | 43.079 |
| 0.7819444444444444 | 38.653 |
| 0.782638888888889 | 38.653 |
| 0.7833333333333333 | 38.653 |
| 0.7840277777777778 | 38.653 |
| 0.7847222222222222 | 34.234 |
| 0.7854166666666668 | 34.234 |
| 0.7861111111111111 | 34.234 |
| 0.7868055555555555 | 34.234 |
| 0.7875 | 29.823 |
| 0.7881944444444445 | 29.823 |
| 0.7888888888888889 | 29.823 |
| 0.7895833333333333 | 29.823 |
| 0.7902777777777777 | 29.823 |
| 0.7909722222222223 | 29.823 |
| 0.7916666666666666 | 25.419 |
| 0.7923611111111111 | 25.419 |
| 0.7930555555555556 | 25.419 |
| 0.7937500000000001 | 21.024 |
| 0.7944444444444444 | 21.024 |
| 0.7951388888888888 | 21.024 |
| 0.7958333333333334 | 21.024 |
| 0.7965277777777778 | 21.024 |
| 0.7972222222222222 | 21.024 |
| 0.7979166666666666 | 16.636 |
| 0.7986111111111112 | 16.636 |
| 0.7993055555555556 | 16.636 |
| 0.7999999999999999 | 16.636 |
| 0.8006944444444444 | 16.636 |
| 0.8013888888888889 | 12.257 |
| 0.8020833333333334 | 12.257 |
| 0.8027777777777777 | 12.257 |
| 0.8034722222222223 | 12.257 |
| 0.8041666666666667 | 7.887 |
| 0.8048611111111111 | 7.887 |
| 0.8055555555555555 | 7.887 |
| 0.80625 | 7.887 |
| 0.8069444444444445 | 7.887 |
| 0.8076388888888889 | 3.525 |
| 0.8083333333333332 | 3.525 |
| 0.8090277777777778 | 3.525 |
| 0.8097222222222222 | 3.525 |
| 0.8104166666666667 | 3.525 |
| 0.811111111111111 | 3.525 |
| 0.8118055555555556 | 3.525 |
| 0.8125 | 3.525 |
| 0.8131944444444444 | 3.525 |
| 0.813888888888889 | 0 |
| 0.8145833333333333 | 0 |
| 0.8152777777777778 | 0 |
| 0.8159722222222222 | 0 |
| 0.8166666666666668 | 0 |
| 0.8173611111111111 | 0 |
| 0.8180555555555555 | 0 |
| 0.81875 | 0 |
| 0.8194444444444445 | 0 |
| 0.8201388888888889 | 0 |
| 0.8208333333333333 | 0 |
| 0.8215277777777777 | 0 |
| 0.8222222222222223 | 0 |
| 0.8229166666666666 | 0 |
| 0.8236111111111111 | 0 |
| 0.8243055555555556 | 0 |
| 0.8250000000000001 | 0 |
| 0.8256944444444444 | 0 |
| 0.8263888888888888 | 0 |
| 0.8270833333333334 | 0 |
| 0.8277777777777778 | 0 |
| 0.8284722222222222 | 0 |
| 0.8291666666666666 | 0 |
| 0.8298611111111112 | 0 |
| 0.8305555555555556 | 0 |
| 0.8312499999999999 | 0 |
| 0.8319444444444444 | 0 |
| 0.8326388888888889 | 0 |
| 0.8333333333333334 | 0 |
| 0.8340277777777777 | 0 |
| 0.8347222222222223 | 0 |
| 0.8354166666666667 | 0 |
| 0.8361111111111111 | 0 |
| 0.8368055555555555 | 0 |
| 0.8375 | 0 |
| 0.8381944444444445 | 0 |
| 0.8388888888888889 | 0 |
| 0.8395833333333332 | 0 |
| 0.8402777777777778 | 0 |
| 0.8409722222222222 | 0 |
| 0.8416666666666667 | 0 |
| 0.842361111111111 | 0 |
| 0.8430555555555556 | 0 |
| 0.84375 | 0 |
| 0.8444444444444444 | 0 |
| 0.845138888888889 | 0 |
| 0.8458333333333333 | 0 |
| 0.8465277777777778 | 0 |
| 0.8472222222222222 | 0 |
| 0.8479166666666668 | 0 |
| 0.8486111111111111 | 0 |
| 0.8493055555555555 | 0 |
| 0.85 | 0 |
| 0.8506944444444445 | 0 |
| 0.8513888888888889 | 0 |
| 0.8520833333333333 | 0 |
| 0.8527777777777777 | 0 |
| 0.8534722222222223 | 0 |
| 0.8541666666666666 | 0 |
| 0.8548611111111111 | 0 |
| 0.8555555555555556 | 0 |
| 0.8562500000000001 | 0 |
| 0.8569444444444444 | 0 |
| 0.8576388888888888 | 0 |
| 0.8583333333333334 | 0 |
| 0.8590277777777778 | 0 |
| 0.8597222222222222 | 0 |
| 0.8604166666666666 | 0 |
| 0.8611111111111112 | 0 |
| 0.8618055555555556 | 0 |
| 0.8624999999999999 | 0 |
| 0.8631944444444444 | 0 |
| 0.8638888888888889 | 0 |
| 0.8645833333333334 | 0 |
| 0.8652777777777777 | 0 |
| 0.8659722222222223 | 0 |
| 0.8666666666666667 | 0 |
| 0.8673611111111111 | 0 |
| 0.8680555555555555 | 0 |
| 0.86875 | 0 |
| 0.8694444444444445 | 0 |
| 0.8701388888888889 | 0 |
| 0.8708333333333332 | 0 |
| 0.8715277777777778 | 0 |
| 0.8722222222222222 | 0 |
| 0.8729166666666667 | 0 |
| 0.873611111111111 | 0 |
| 0.8743055555555556 | 0 |
| 0.875 | 0 |
| 0.8756944444444444 | 0 |
| 0.876388888888889 | 0 |
| 0.8770833333333333 | 0 |
| 0.8777777777777778 | 0 |
| 0.8784722222222222 | 0 |
| 0.8791666666666668 | 0 |
| 0.8798611111111111 | 0 |
| 0.8805555555555555 | 0 |
| 0.88125 | 0 |
| 0.8819444444444445 | 0 |
| 0.8826388888888889 | 0 |
| 0.8833333333333333 | 0 |
| 0.8840277777777777 | 0 |
| 0.8847222222222223 | 0 |
| 0.8854166666666666 | 0 |
| 0.8861111111111111 | 0 |
| 0.8868055555555556 | 0 |
| 0.8875000000000001 | 0 |
| 0.8881944444444444 | 0 |
| 0.8888888888888888 | 0 |
| 0.8895833333333334 | 0 |
| 0.8902777777777778 | 0 |
| 0.8909722222222222 | 0 |
| 0.8916666666666666 | 0 |
| 0.8923611111111112 | 0 |
| 0.8930555555555556 | 0 |
| 0.8937499999999999 | 0 |
| 0.8944444444444444 | 0 |
| 0.8951388888888889 | 0 |
| 0.8958333333333334 | 0 |
| 0.8965277777777777 | 0 |
| 0.8972222222222223 | 0 |
| 0.8979166666666667 | 0 |
| 0.8986111111111111 | 0 |
| 0.8993055555555555 | 0 |
| 0.9 | 0 |
| 0.9006944444444445 | 0 |
| 0.9013888888888889 | 0 |
| 0.9020833333333332 | 0 |
| 0.9027777777777778 | 0 |
| 0.9034722222222222 | 0 |
| 0.9041666666666667 | 0 |
| 0.904861111111111 | 0 |
| 0.9055555555555556 | 0 |
| 0.90625 | 0 |
| 0.9069444444444444 | 0 |
| 0.907638888888889 | 0 |
| 0.9083333333333333 | 0 |
| 0.9090277777777778 | 0 |
| 0.9097222222222222 | 0 |
| 0.9104166666666668 | 0 |
| 0.9111111111111111 | 0 |
| 0.9118055555555555 | 0 |
| 0.9125 | 0 |
| 0.9131944444444445 | 0 |
| 0.9138888888888889 | 0 |
| 0.9145833333333333 | 0 |
| 0.9152777777777777 | 0 |
| 0.9159722222222223 | 0 |
| 0.9166666666666666 | 0 |
| 0.9173611111111111 | 0 |
| 0.9180555555555556 | 0 |
| 0.9187500000000001 | 0 |
| 0.9194444444444444 | 0 |
| 0.9201388888888888 | 0 |
| 0.9208333333333334 | 0 |
| 0.9215277777777778 | 0 |
| 0.9222222222222222 | 0 |
| 0.9229166666666666 | 0 |
| 0.9236111111111112 | 0 |
| 0.9243055555555556 | 0 |
| 0.9249999999999999 | 0 |
| 0.9256944444444444 | 0 |
| 0.9263888888888889 | 0 |
| 0.9270833333333334 | 0 |
| 0.9277777777777777 | 0 |
| 0.9284722222222223 | 0 |
| 0.9291666666666667 | 0 |
| 0.9298611111111111 | 0 |
| 0.9305555555555555 | 0 |
| 0.93125 | 0 |
| 0.9319444444444445 | 0 |
| 0.9326388888888889 | 0 |
| 0.9333333333333332 | 0 |
| 0.9340277777777778 | 0 |
| 0.9347222222222222 | 0 |
| 0.9354166666666667 | 0 |
| 0.936111111111111 | 0 |
| 0.9368055555555556 | 0 |
| 0.9375 | 0 |
| 0.9381944444444444 | 0 |
| 0.938888888888889 | 0 |
| 0.9395833333333333 | 0 |
| 0.9402777777777778 | 0 |
| 0.9409722222222222 | 0 |
| 0.9416666666666668 | 0 |
| 0.9423611111111111 | 0 |
| 0.9430555555555555 | 0 |
| 0.94375 | 0 |
| 0.9444444444444445 | 0 |
| 0.9451388888888889 | 0 |
| 0.9458333333333333 | 0 |
| 0.9465277777777777 | 0 |
| 0.9472222222222223 | 0 |
| 0.9479166666666666 | 0 |
| 0.9486111111111111 | 0 |
| 0.9493055555555556 | 0 |
| 0.9500000000000001 | 0 |
| 0.9506944444444444 | 0 |
| 0.9513888888888888 | 0 |
| 0.9520833333333334 | 0 |
| 0.9527777777777778 | 0 |
| 0.9534722222222222 | 0 |
| 0.9541666666666666 | 0 |
| 0.9548611111111112 | 0 |
| 0.9555555555555556 | 0 |
| 0.9562499999999999 | 0 |
| 0.9569444444444444 | 0 |
| 0.9576388888888889 | 0 |
| 0.9583333333333334 | 0 |
| 0.9590277777777777 | 0 |
| 0.9597222222222223 | 0 |
| 0.9604166666666667 | 0 |
| 0.9611111111111111 | 0 |
| 0.9618055555555555 | 0 |
| 0.9625 | 0 |
| 0.9631944444444445 | 0 |
| 0.9638888888888889 | 0 |
| 0.9645833333333332 | 0 |
| 0.9652777777777778 | 0 |
| 0.9659722222222222 | 0 |
| 0.9666666666666667 | 0 |
| 0.967361111111111 | 0 |
| 0.9680555555555556 | 0 |
| 0.96875 | 0 |
| 0.9694444444444444 | 0 |
| 0.970138888888889 | 0 |
| 0.9708333333333333 | 0 |
| 0.9715277777777778 | 0 |
| 0.9722222222222222 | 0 |
| 0.9729166666666668 | 0 |
| 0.9736111111111111 | 0 |
| 0.9743055555555555 | 0 |
| 0.975 | 0 |
| 0.9756944444444445 | 0 |
| 0.9763888888888889 | 0 |
| 0.9770833333333333 | 0 |
| 0.9777777777777777 | 0 |
| 0.9784722222222223 | 0 |
| 0.9791666666666666 | 0 |
| 0.9798611111111111 | 0 |
| 0.9805555555555556 | 0 |
| 0.9812500000000001 | 0 |
| 0.9819444444444444 | 0 |
| 0.9826388888888888 | 0 |
| 0.9833333333333334 | 0 |
| 0.9840277777777778 | 0 |
| 0.9847222222222222 | 0 |
| 0.9854166666666666 | 0 |
| 0.9861111111111112 | 0 |
| 0.9868055555555556 | 0 |
| 0.9874999999999999 | 0 |
| 0.9881944444444444 | 0 |
| 0.9888888888888889 | 0 |
| 0.9895833333333334 | 0 |
| 0.9902777777777777 | 0 |
| 0.9909722222222223 | 0 |
| 0.9916666666666667 | 0 |
| 0.9923611111111111 | 0 |
| 0.9930555555555555 | 0 |
| 0.99375 | 0 |
| 0.9944444444444445 | 0 |
| 0.9951388888888889 | 0 |
| 0.9958333333333332 | 0 |
| 0.9965277777777778 | 0 |
| 0.9972222222222222 | 0 |
| 0.9979166666666667 | 0 |
| 0.998611111111111 | 0 |
| 0.9993055555555556 | 0 |